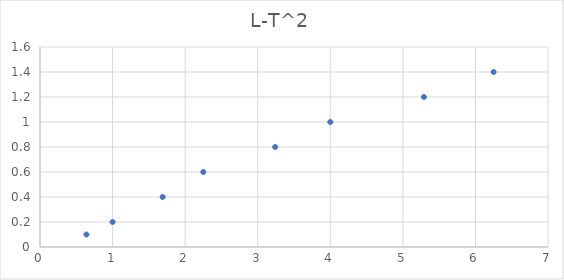
| Category | Series 0 |
|---|---|
| 0.64 | 0.1 |
| 1.0 | 0.2 |
| 1.69 | 0.4 |
| 2.25 | 0.6 |
| 3.24 | 0.8 |
| 4.0 | 1 |
| 5.29 | 1.2 |
| 6.25 | 1.4 |